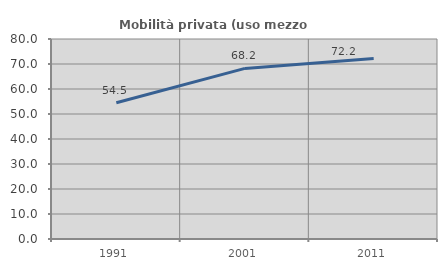
| Category | Mobilità privata (uso mezzo privato) |
|---|---|
| 1991.0 | 54.486 |
| 2001.0 | 68.246 |
| 2011.0 | 72.194 |